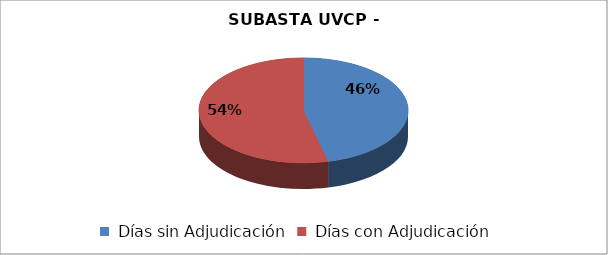
| Category | Series 0 |
|---|---|
| Días sin Adjudicación | 159 |
| Días con Adjudicación  | 185 |